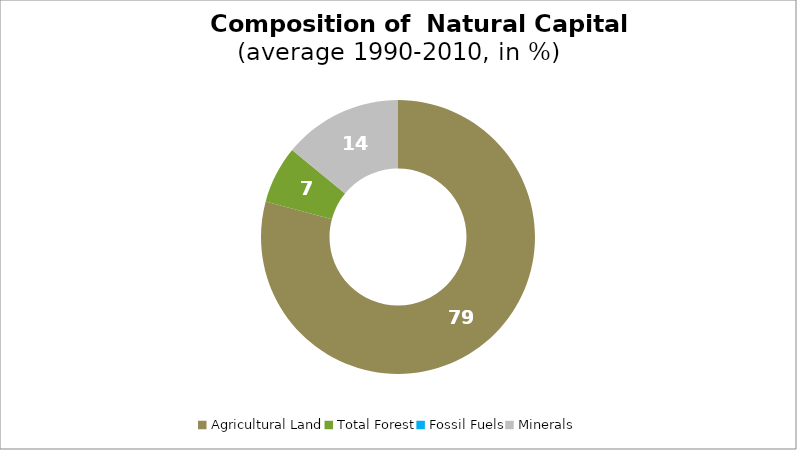
| Category | Series 0 |
|---|---|
| Agricultural Land | 79.186 |
| Total Forest | 6.753 |
| Fossil Fuels | 0 |
| Minerals | 14.061 |